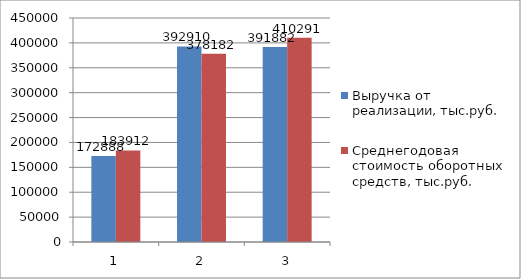
| Category | Выручка от реализации, тыс.руб. | Среднегодовая стоимость оборотных средств, тыс.руб. |
|---|---|---|
| 0 | 172888 | 183912 |
| 1 | 392910 | 378182 |
| 2 | 391882 | 410291 |